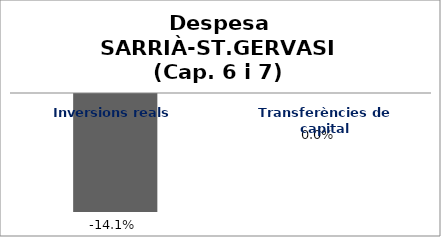
| Category | Series 0 |
|---|---|
| Inversions reals | -0.141 |
| Transferències de capital | 0 |